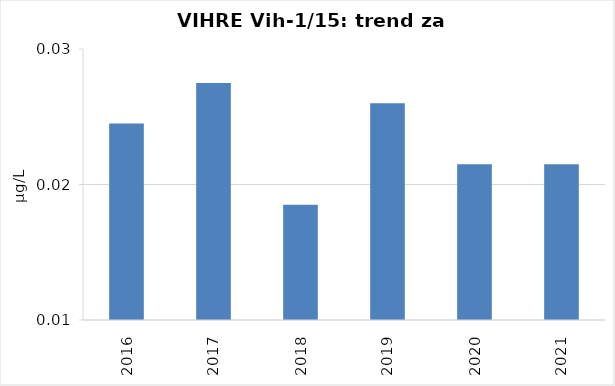
| Category | Vsota |
|---|---|
| 2016 | 0.024 |
| 2017 | 0.028 |
| 2018 | 0.019 |
| 2019 | 0.026 |
| 2020 | 0.022 |
| 2021 | 0.022 |